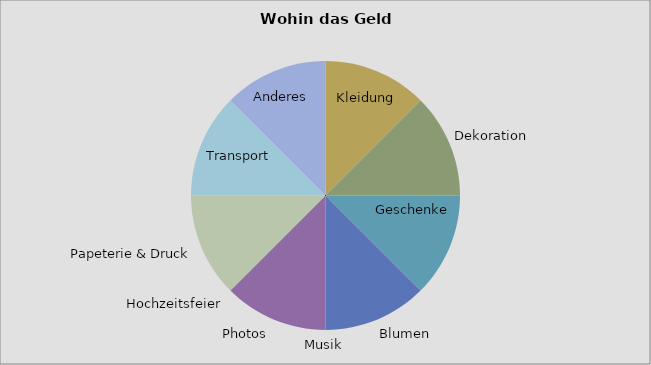
| Category | Betrag |
|---|---|
| Kleidung | 1 |
| Dekoration | 1 |
| Geschenke | 1 |
| Blumen | 1 |
| Musik | 0 |
| Photos | 1 |
| Hochzeitsfeier | 0 |
| Papeterie & Druck | 1 |
| Transport | 1 |
| Anderes | 1 |